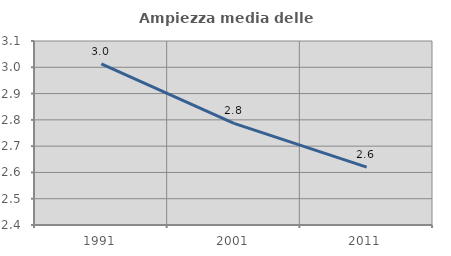
| Category | Ampiezza media delle famiglie |
|---|---|
| 1991.0 | 3.013 |
| 2001.0 | 2.786 |
| 2011.0 | 2.62 |